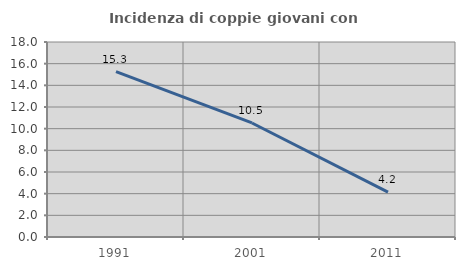
| Category | Incidenza di coppie giovani con figli |
|---|---|
| 1991.0 | 15.274 |
| 2001.0 | 10.526 |
| 2011.0 | 4.15 |